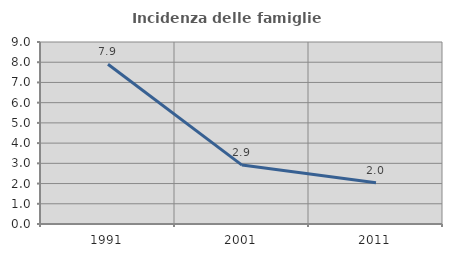
| Category | Incidenza delle famiglie numerose |
|---|---|
| 1991.0 | 7.902 |
| 2001.0 | 2.912 |
| 2011.0 | 2.038 |